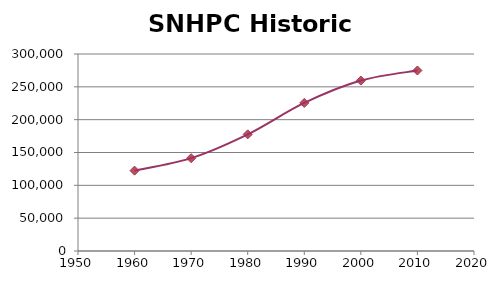
| Category | Series 0 |
|---|---|
| 1960.0 | 122383 |
| 1970.0 | 141363 |
| 1980.0 | 177642 |
| 1990.0 | 225479 |
| 2000.0 | 259547 |
| 2010.0 | 274854 |